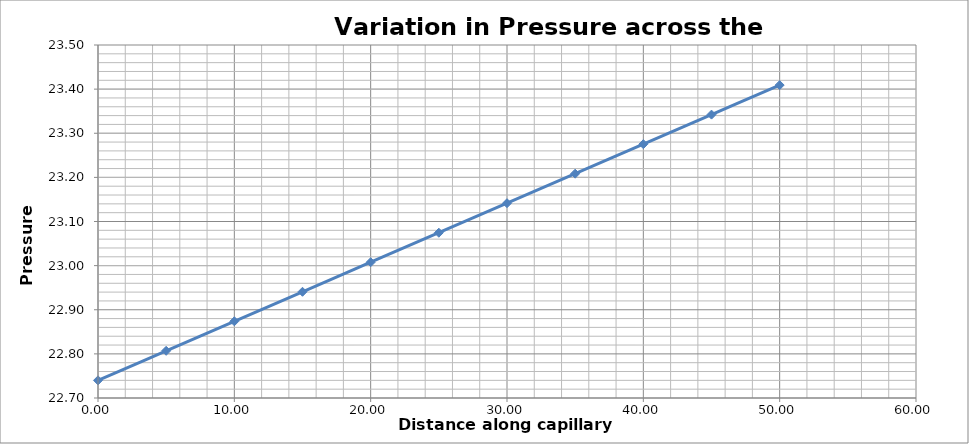
| Category | Series 0 |
|---|---|
| 0.0 | 22.74 |
| 5.0 | 22.807 |
| 10.0 | 22.874 |
| 15.0 | 22.941 |
| 20.0 | 23.008 |
| 25.0 | 23.075 |
| 30.0 | 23.141 |
| 35.0 | 23.208 |
| 40.0 | 23.275 |
| 45.0 | 23.342 |
| 50.0 | 23.409 |